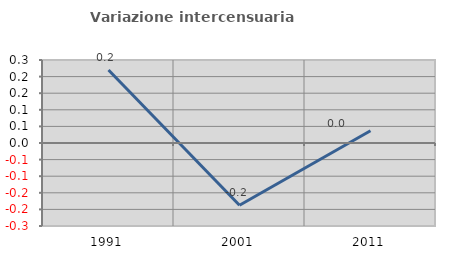
| Category | Variazione intercensuaria annua |
|---|---|
| 1991.0 | 0.22 |
| 2001.0 | -0.187 |
| 2011.0 | 0.037 |